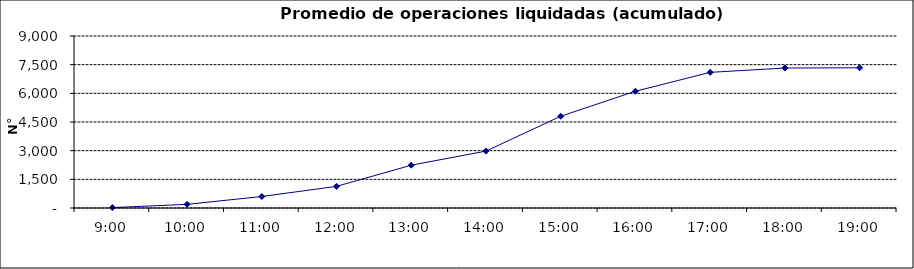
| Category | Promedio Op.Liquidadas (acumulado) |
|---|---|
| 0.375 | 20.636 |
| 0.4166666666666667 | 190.5 |
| 0.4583333333333333 | 600.955 |
| 0.5 | 1132.227 |
| 0.5416666666666666 | 2239.818 |
| 0.5833333333333334 | 2976.864 |
| 0.625 | 4801 |
| 0.6666666666666666 | 6109.409 |
| 0.7083333333333334 | 7097.636 |
| 0.75 | 7324.636 |
| 0.7916666666666666 | 7336.636 |